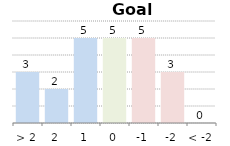
| Category | Goal difference |
|---|---|
| > 2 | 3 |
| 2 | 2 |
| 1 | 5 |
| 0 | 5 |
| -1 | 5 |
| -2 | 3 |
| < -2 | 0 |